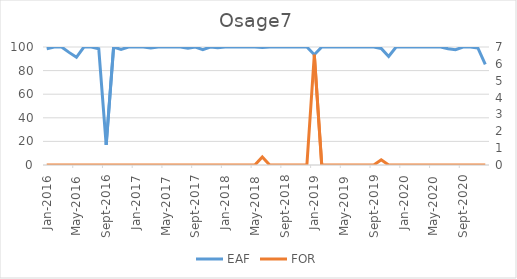
| Category | EAF |
|---|---|
| 2016-01-01 | 98.54 |
| 2016-02-01 | 100 |
| 2016-03-01 | 100 |
| 2016-04-01 | 95.44 |
| 2016-05-01 | 91.29 |
| 2016-06-01 | 100 |
| 2016-07-01 | 100 |
| 2016-08-01 | 98.52 |
| 2016-09-01 | 17 |
| 2016-10-01 | 100 |
| 2016-11-01 | 97.97 |
| 2016-12-01 | 100 |
| 2017-01-01 | 100 |
| 2017-02-01 | 100 |
| 2017-03-01 | 99.13 |
| 2017-04-01 | 100 |
| 2017-05-01 | 100 |
| 2017-06-01 | 100 |
| 2017-07-01 | 100 |
| 2017-08-01 | 98.92 |
| 2017-09-01 | 100 |
| 2017-10-01 | 97.78 |
| 2017-11-01 | 100 |
| 2017-12-01 | 99.43 |
| 2018-01-01 | 100 |
| 2018-02-01 | 100 |
| 2018-03-01 | 100 |
| 2018-04-01 | 100 |
| 2018-05-01 | 100 |
| 2018-06-01 | 99.54 |
| 2018-07-01 | 100 |
| 2018-08-01 | 100 |
| 2018-09-01 | 100 |
| 2018-10-01 | 100 |
| 2018-11-01 | 100 |
| 2018-12-01 | 100 |
| 2019-01-01 | 93.48 |
| 2019-02-01 | 100 |
| 2019-03-01 | 100 |
| 2019-04-01 | 100 |
| 2019-05-01 | 100 |
| 2019-06-01 | 100 |
| 2019-07-01 | 100 |
| 2019-08-01 | 100 |
| 2019-09-01 | 100 |
| 2019-10-01 | 98.76 |
| 2019-11-01 | 91.92 |
| 2019-12-01 | 100 |
| 2020-01-01 | 100 |
| 2020-02-01 | 100 |
| 2020-03-01 | 100 |
| 2020-04-01 | 100 |
| 2020-05-01 | 100 |
| 2020-06-01 | 100 |
| 2020-07-01 | 98.56 |
| 2020-08-01 | 97.71 |
| 2020-09-01 | 100 |
| 2020-10-01 | 100 |
| 2020-11-01 | 99.17 |
| 2020-12-01 | 85.22 |